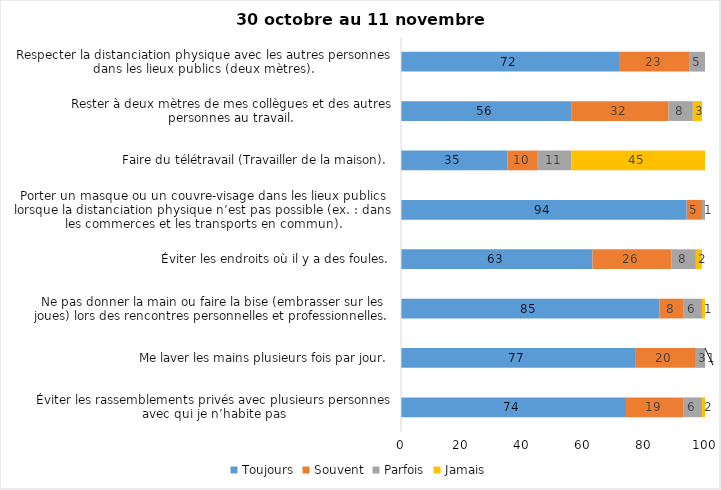
| Category | Toujours | Souvent | Parfois | Jamais |
|---|---|---|---|---|
| Éviter les rassemblements privés avec plusieurs personnes avec qui je n’habite pas | 74 | 19 | 6 | 2 |
| Me laver les mains plusieurs fois par jour. | 77 | 20 | 3 | 1 |
| Ne pas donner la main ou faire la bise (embrasser sur les joues) lors des rencontres personnelles et professionnelles. | 85 | 8 | 6 | 1 |
| Éviter les endroits où il y a des foules. | 63 | 26 | 8 | 2 |
| Porter un masque ou un couvre-visage dans les lieux publics lorsque la distanciation physique n’est pas possible (ex. : dans les commerces et les transports en commun). | 94 | 5 | 1 | 0 |
| Faire du télétravail (Travailler de la maison). | 35 | 10 | 11 | 45 |
| Rester à deux mètres de mes collègues et des autres personnes au travail. | 56 | 32 | 8 | 3 |
| Respecter la distanciation physique avec les autres personnes dans les lieux publics (deux mètres). | 72 | 23 | 5 | 0 |